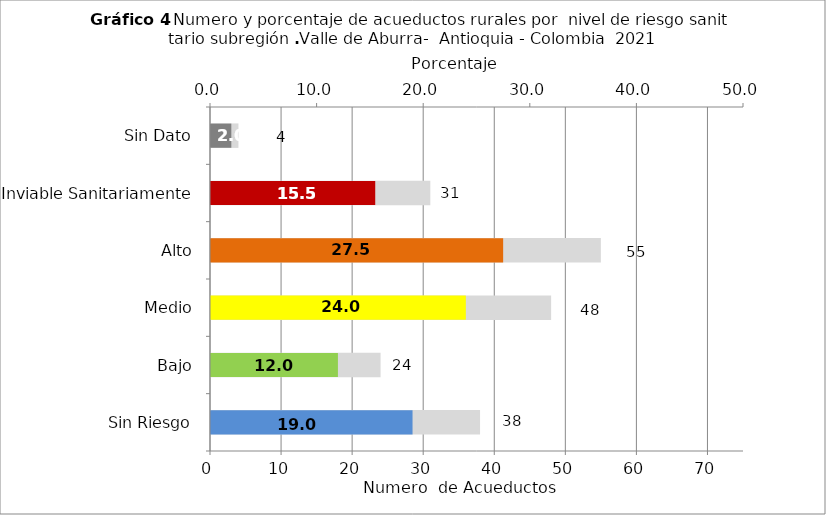
| Category | Número de Sistemas |
|---|---|
| Sin Riesgo | 38 |
| Bajo | 24 |
| Medio | 48 |
| Alto | 55 |
| Inviable Sanitariamente | 31 |
| Sin Dato | 4 |